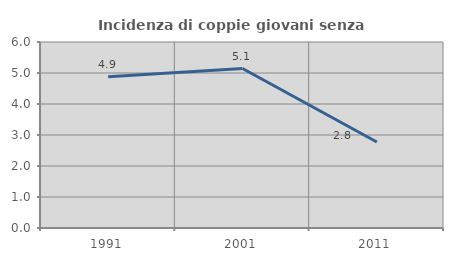
| Category | Incidenza di coppie giovani senza figli |
|---|---|
| 1991.0 | 4.876 |
| 2001.0 | 5.143 |
| 2011.0 | 2.774 |